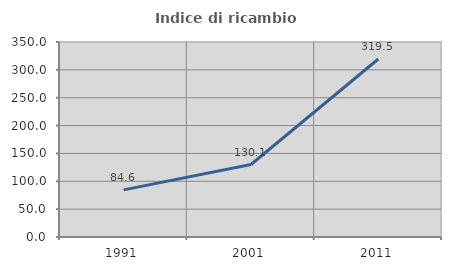
| Category | Indice di ricambio occupazionale  |
|---|---|
| 1991.0 | 84.579 |
| 2001.0 | 130.118 |
| 2011.0 | 319.527 |